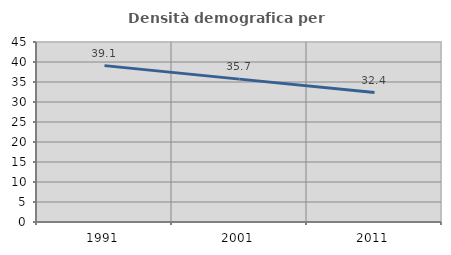
| Category | Densità demografica |
|---|---|
| 1991.0 | 39.092 |
| 2001.0 | 35.718 |
| 2011.0 | 32.372 |